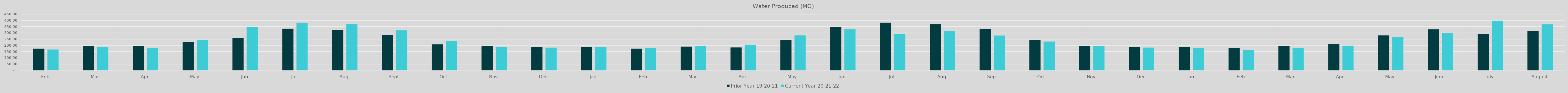
| Category | Prior Year 19-20-21 | Current Year 20-21-22 |
|---|---|---|
| Feb | 173.847 | 167.532 |
| Mar | 195.333 | 190.306 |
| Apr | 193.551 | 178.22 |
| May | 228.091 | 240.625 |
| Jun | 257.9 | 348.57 |
| Jul | 333.37 | 381.34 |
| Aug | 323.49 | 370.12 |
| Sep | 282.53 | 320.39 |
| Oct | 208.72 | 233.34 |
| Nov | 193.92 | 187.14 |
| Dec | 188.86 | 182.02 |
| Jan | 189.94 | 189.96 |
| Feb | 173.75 | 178.97 |
| Mar | 190.77 | 195.96 |
| Apr | 184.23 | 203.05 |
| May | 240.63 | 280.19 |
| Jun | 348.57 | 329.038 |
| Jul | 381.336 | 293.585 |
| Aug | 370.12 | 314.51 |
| Sep | 331.274 | 279.105 |
| Oct | 242.62 | 230.88 |
| Nov | 193.57 | 196.185 |
| Dec | 188.584 | 182.826 |
| Jan | 189.967 | 179.43 |
| Feb | 178.97 | 165.72 |
| Mar | 195.963 | 178.569 |
| Apr | 209.272 | 197.981 |
| May | 280.192 | 268.985 |
| June | 329.04 | 300.92 |
| July | 293.59 | 397.41 |
| August | 314.51 | 368.297 |